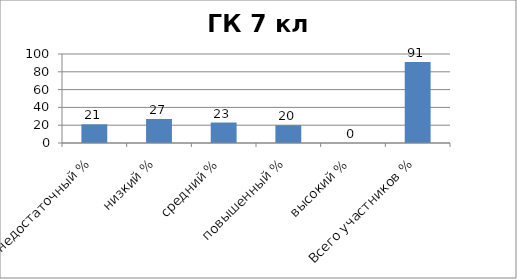
| Category | Series 0 |
|---|---|
| недостаточный % | 21 |
| низкий % | 27 |
| средний % | 23 |
| повышенный % | 20 |
| высокий % | 0 |
| Всего участников % | 91 |